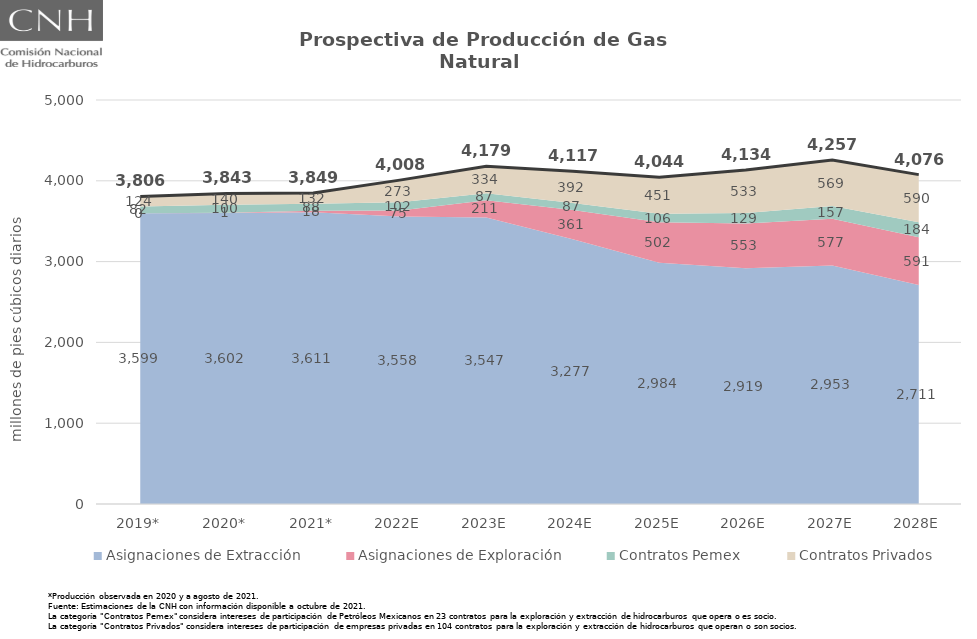
| Category | Total |
|---|---|
| 2019* | 3805.803 |
| 2020* | 3843.294 |
| 2021* | 3849.199 |
| 2022E | 4008.376 |
| 2023E | 4179.05 |
| 2024E | 4117.394 |
| 2025E | 4043.836 |
| 2026E | 4134.109 |
| 2027E | 4256.774 |
| 2028E | 4076.424 |